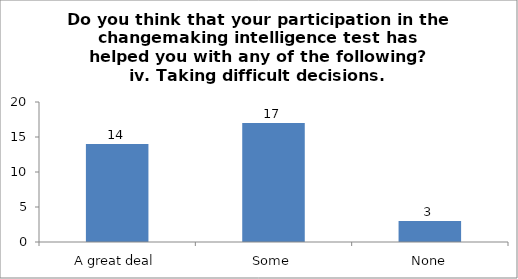
| Category | Do you think that your participation in the changemaking intelligence test has helped you with any of the following?
iv. Taking difficult decisions. |
|---|---|
| A great deal | 14 |
| Some | 17 |
| None | 3 |